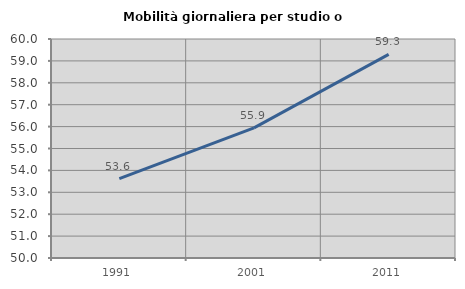
| Category | Mobilità giornaliera per studio o lavoro |
|---|---|
| 1991.0 | 53.621 |
| 2001.0 | 55.941 |
| 2011.0 | 59.298 |